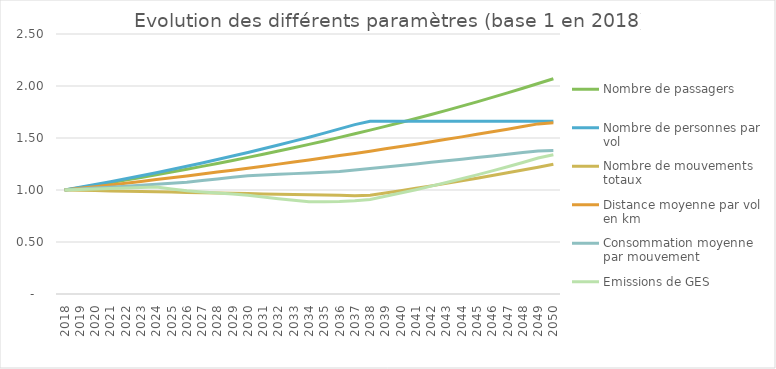
| Category | Nombre de passagers | Nombre de personnes par vol | Nombre de mouvements totaux | Distance moyenne par vol en km | Consommation moyenne par mouvement  | Emissions de GES |
|---|---|---|---|---|---|---|
| 2018.0 | 1 | 1 | 1 | 1 | 1 | 1 |
| 2019.0 | 1.023 | 1.026 | 0.997 | 1.016 | 1.009 | 1.005 |
| 2020.0 | 1.047 | 1.053 | 0.994 | 1.032 | 1.018 | 1.009 |
| 2021.0 | 1.071 | 1.08 | 0.991 | 1.049 | 1.027 | 1.014 |
| 2022.0 | 1.095 | 1.108 | 0.988 | 1.066 | 1.036 | 1.019 |
| 2023.0 | 1.12 | 1.137 | 0.985 | 1.083 | 1.046 | 1.024 |
| 2024.0 | 1.146 | 1.166 | 0.983 | 1.1 | 1.055 | 1.029 |
| 2025.0 | 1.173 | 1.197 | 0.98 | 1.118 | 1.065 | 1.01 |
| 2026.0 | 1.2 | 1.228 | 0.977 | 1.135 | 1.074 | 0.992 |
| 2027.0 | 1.227 | 1.26 | 0.974 | 1.154 | 1.09 | 0.981 |
| 2028.0 | 1.255 | 1.293 | 0.971 | 1.172 | 1.107 | 0.971 |
| 2029.0 | 1.284 | 1.326 | 0.968 | 1.191 | 1.123 | 0.961 |
| 2030.0 | 1.314 | 1.361 | 0.965 | 1.21 | 1.137 | 0.949 |
| 2031.0 | 1.344 | 1.396 | 0.963 | 1.229 | 1.144 | 0.932 |
| 2032.0 | 1.375 | 1.432 | 0.96 | 1.249 | 1.151 | 0.916 |
| 2033.0 | 1.406 | 1.47 | 0.957 | 1.269 | 1.157 | 0.901 |
| 2034.0 | 1.439 | 1.508 | 0.954 | 1.289 | 1.164 | 0.887 |
| 2035.0 | 1.472 | 1.547 | 0.951 | 1.31 | 1.171 | 0.888 |
| 2036.0 | 1.506 | 1.587 | 0.949 | 1.331 | 1.178 | 0.889 |
| 2037.0 | 1.54 | 1.629 | 0.946 | 1.352 | 1.193 | 0.896 |
| 2038.0 | 1.576 | 1.66 | 0.949 | 1.374 | 1.207 | 0.908 |
| 2039.0 | 1.612 | 1.66 | 0.971 | 1.396 | 1.221 | 0.939 |
| 2040.0 | 1.649 | 1.66 | 0.993 | 1.418 | 1.236 | 0.971 |
| 2041.0 | 1.687 | 1.66 | 1.016 | 1.441 | 1.251 | 1.003 |
| 2042.0 | 1.726 | 1.66 | 1.04 | 1.464 | 1.266 | 1.037 |
| 2043.0 | 1.766 | 1.66 | 1.064 | 1.487 | 1.281 | 1.072 |
| 2044.0 | 1.806 | 1.66 | 1.088 | 1.511 | 1.296 | 1.108 |
| 2045.0 | 1.848 | 1.66 | 1.113 | 1.535 | 1.312 | 1.145 |
| 2046.0 | 1.89 | 1.66 | 1.139 | 1.56 | 1.328 | 1.184 |
| 2047.0 | 1.934 | 1.66 | 1.165 | 1.585 | 1.344 | 1.223 |
| 2048.0 | 1.978 | 1.66 | 1.192 | 1.61 | 1.36 | 1.265 |
| 2049.0 | 2.024 | 1.66 | 1.219 | 1.636 | 1.376 | 1.307 |
| 2050.0 | 2.07 | 1.66 | 1.247 | 1.647 | 1.38 | 1.339 |